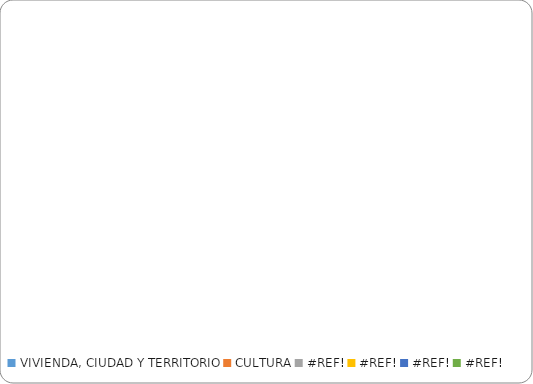
| Category | Series 0 |
|---|---|
| VIVIENDA, CIUDAD Y TERRITORIO | 0 |
| CULTURA | 0 |
| #¡REF! | 0 |
| #¡REF! | 0 |
| #¡REF! | 0 |
| #¡REF! | 0 |